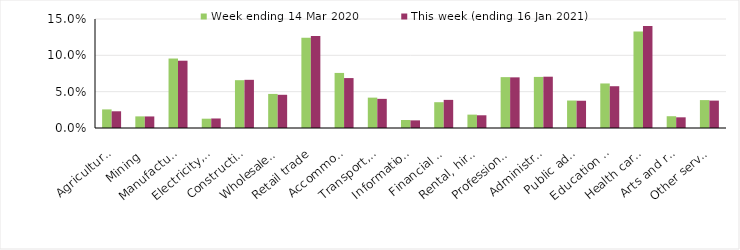
| Category | Week ending 14 Mar 2020 | This week (ending 16 Jan 2021) |
|---|---|---|
| Agriculture, forestry and fishing | 0.026 | 0.023 |
| Mining | 0.016 | 0.016 |
| Manufacturing | 0.096 | 0.093 |
| Electricity, gas, water and waste services | 0.013 | 0.013 |
| Construction | 0.066 | 0.066 |
| Wholesale trade | 0.047 | 0.046 |
| Retail trade | 0.124 | 0.127 |
| Accommodation and food services | 0.076 | 0.069 |
| Transport, postal and warehousing | 0.042 | 0.04 |
| Information media and telecommunications | 0.011 | 0.01 |
| Financial and insurance services | 0.036 | 0.039 |
| Rental, hiring and real estate services | 0.018 | 0.018 |
| Professional, scientific and technical services | 0.07 | 0.07 |
| Administrative and support services | 0.07 | 0.071 |
| Public administration and safety | 0.038 | 0.038 |
| Education and training | 0.061 | 0.058 |
| Health care and social assistance | 0.133 | 0.14 |
| Arts and recreation services | 0.016 | 0.015 |
| Other services | 0.038 | 0.038 |